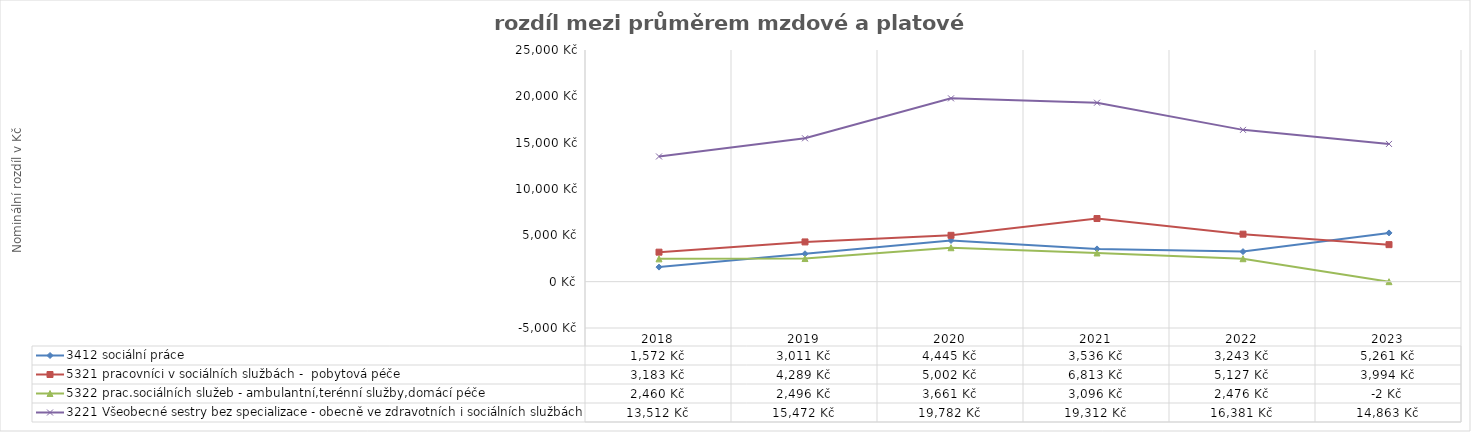
| Category | 3412 sociální práce | 5321 pracovníci v sociálních službách -  pobytová péče | 5322 prac.sociálních služeb - ambulantní,terénní služby,domácí péče  | 3221 Všeobecné sestry bez specializace - obecně ve zdravotních i sociálních službách |
|---|---|---|---|---|
| 2018.0 | 1571.655 | 3182.939 | 2459.598 | 13512.11 |
| 2019.0 | 3011 | 4289 | 2496 | 15472 |
| 2020.0 | 4445 | 5002 | 3661 | 19782 |
| 2021.0 | 3535.884 | 6813.344 | 3095.75 | 19312.138 |
| 2022.0 | 3243 | 5127 | 2476 | 16381 |
| 2023.0 | 5261 | 3994 | -2 | 14863 |